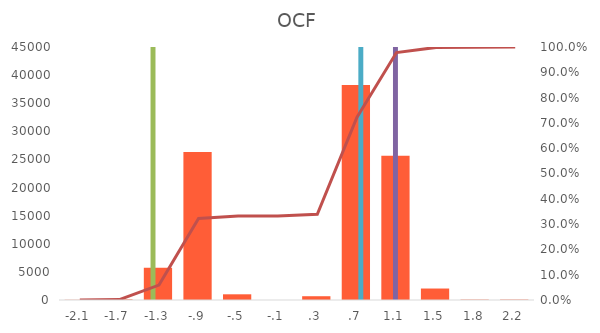
| Category | Min |
|---|---|
| -2103873.772633333 | 39 |
| -1708709.5813666666 | 113 |
| -1313545.3901 | 5748 |
| -918381.1988333333 | 26320 |
| -523217.0075666667 | 1014 |
| -128052.81630000006 | 0 |
| 267111.37496666657 | 673 |
| 662275.5662333332 | 38260 |
| 1057439.7574999998 | 25637 |
| 1452603.9487666665 | 2041 |
| 1847768.140033333 | 75 |
| 2242932.3312999997 | 80 |